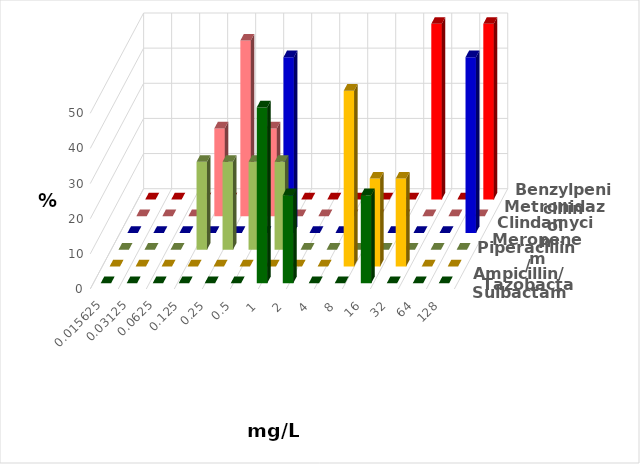
| Category | Ampicillin/ Sulbactam | Piperacillin/ Tazobactam | Meropenem | Clindamycin | Metronidazol | Benzylpenicillin |
|---|---|---|---|---|---|---|
| 0.015625 | 0 | 0 | 0 | 0 | 0 | 0 |
| 0.03125 | 0 | 0 | 0 | 0 | 0 | 0 |
| 0.0625 | 0 | 0 | 0 | 0 | 0 | 0 |
| 0.125 | 0 | 0 | 25 | 0 | 25 | 0 |
| 0.25 | 0 | 0 | 25 | 0 | 50 | 0 |
| 0.5 | 0 | 0 | 25 | 0 | 25 | 0 |
| 1.0 | 50 | 0 | 25 | 50 | 0 | 0 |
| 2.0 | 25 | 0 | 0 | 0 | 0 | 0 |
| 4.0 | 0 | 0 | 0 | 0 | 0 | 0 |
| 8.0 | 0 | 50 | 0 | 0 | 0 | 0 |
| 16.0 | 25 | 25 | 0 | 0 | 0 | 0 |
| 32.0 | 0 | 25 | 0 | 0 | 0 | 50 |
| 64.0 | 0 | 0 | 0 | 0 | 0 | 0 |
| 128.0 | 0 | 0 | 0 | 50 | 0 | 50 |